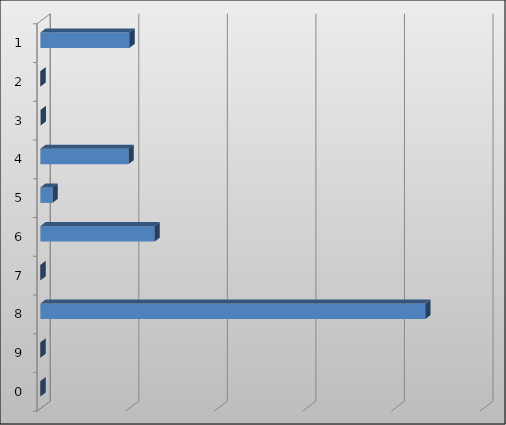
| Category | Series 0 |
|---|---|
| 1.0 | 10051672 |
| 2.0 | 0 |
| 3.0 | 44100 |
| 4.0 | 9953343 |
| 5.0 | 1363548 |
| 6.0 | 12899254 |
| 7.0 | 0 |
| 8.0 | 43469965 |
| 9.0 | 0 |
| 0.0 | 0 |